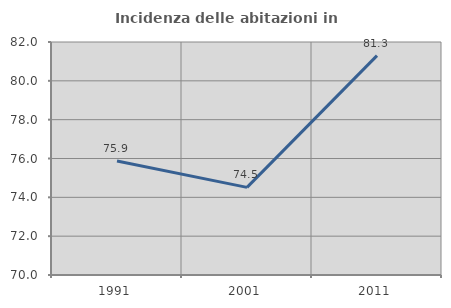
| Category | Incidenza delle abitazioni in proprietà  |
|---|---|
| 1991.0 | 75.867 |
| 2001.0 | 74.512 |
| 2011.0 | 81.297 |